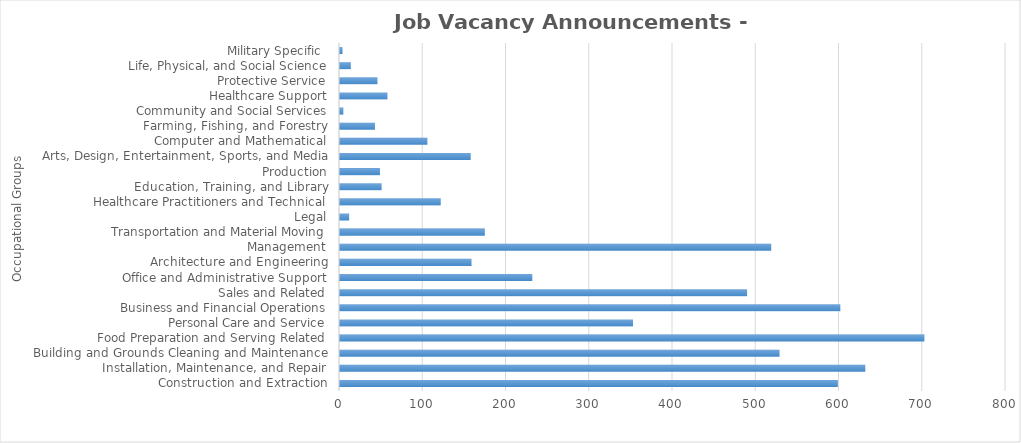
| Category | Total JVAs |
|---|---|
| Construction and Extraction | 598 |
| Installation, Maintenance, and Repair | 631 |
| Building and Grounds Cleaning and Maintenance | 528 |
| Food Preparation and Serving Related | 702 |
| Personal Care and Service | 352 |
| Business and Financial Operations | 601 |
| Sales and Related | 489 |
| Office and Administrative Support | 231 |
| Architecture and Engineering | 158 |
| Management | 518 |
| Transportation and Material Moving | 174 |
| Legal | 11 |
| Healthcare Practitioners and Technical | 121 |
| Education, Training, and Library | 50 |
| Production | 48 |
| Arts, Design, Entertainment, Sports, and Media | 157 |
| Computer and Mathematical | 105 |
| Farming, Fishing, and Forestry | 42 |
| Community and Social Services | 4 |
| Healthcare Support | 57 |
| Protective Service | 45 |
| Life, Physical, and Social Science | 13 |
| Military Specific  | 3 |